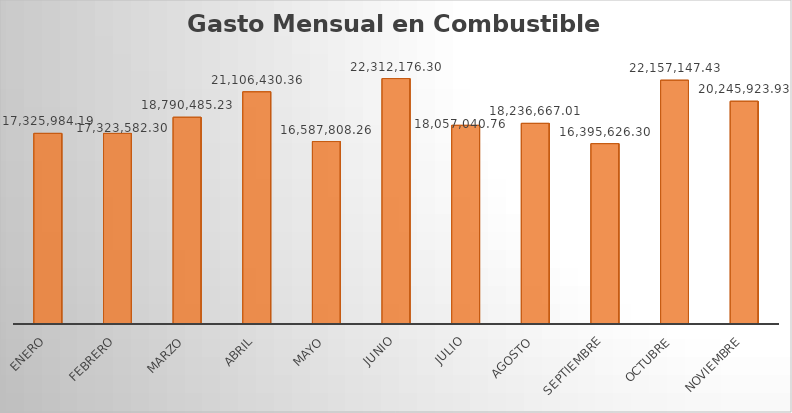
| Category | Monto |
|---|---|
| ENERO | 17325984.19 |
| FEBRERO | 17323582.3 |
| MARZO | 18790485.23 |
| ABRIL | 21106430.36 |
| MAYO | 16587808.26 |
| JUNIO | 22312176.3 |
| JULIO | 18057040.76 |
| AGOSTO | 18236667.01 |
| SEPTIEMBRE | 16395626.3 |
| OCTUBRE | 22157147.43 |
| NOVIEMBRE | 20245923.93 |